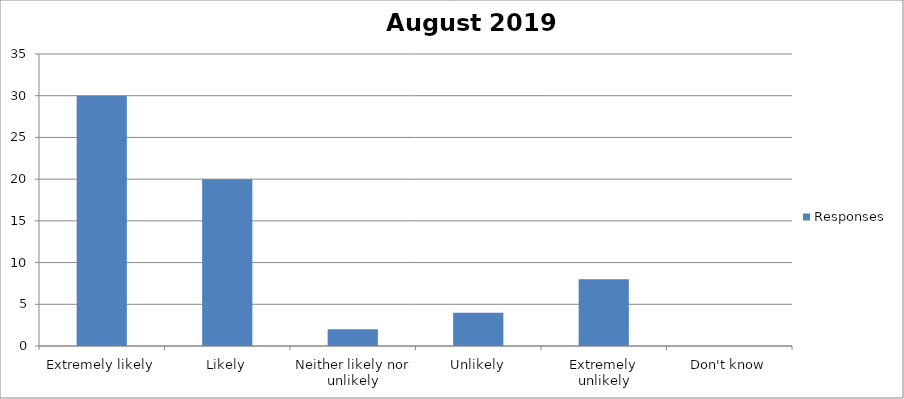
| Category | Responses |
|---|---|
| Extremely likely | 30 |
| Likely | 20 |
| Neither likely nor unlikely | 2 |
| Unlikely | 4 |
| Extremely unlikely | 8 |
| Don't know | 0 |